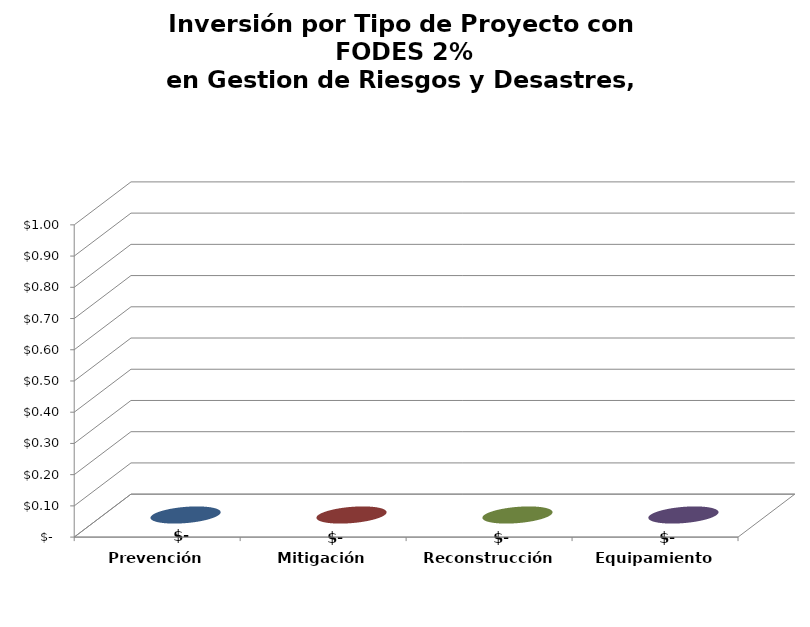
| Category | Series 0 |
|---|---|
| Prevención | 0 |
| Mitigación | 0 |
| Reconstrucción | 0 |
| Equipamiento | 0 |